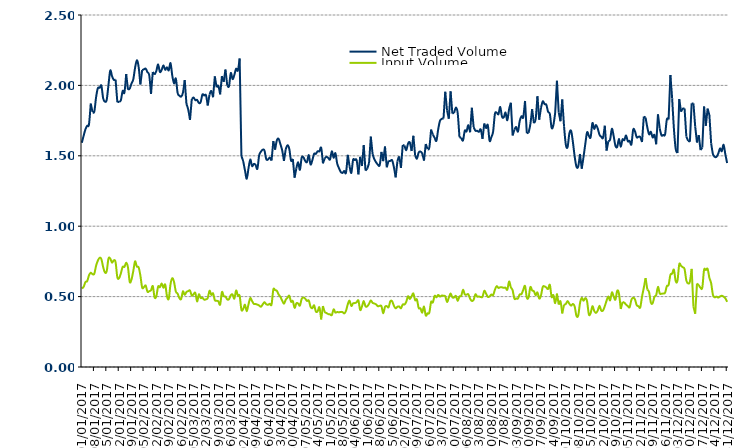
| Category | Net Traded Volume | Input Volume |
|---|---|---|
| 01/01/2017 | 1.593 | 0.557 |
| 02/01/2017 | 1.643 | 0.57 |
| 03/01/2017 | 1.688 | 0.604 |
| 04/01/2017 | 1.713 | 0.61 |
| 05/01/2017 | 1.723 | 0.651 |
| 06/01/2017 | 1.871 | 0.67 |
| 07/01/2017 | 1.812 | 0.66 |
| 08/01/2017 | 1.814 | 0.662 |
| 09/01/2017 | 1.915 | 0.719 |
| 10/01/2017 | 1.981 | 0.755 |
| 11/01/2017 | 1.983 | 0.776 |
| 12/01/2017 | 1.998 | 0.766 |
| 13/01/2017 | 1.908 | 0.709 |
| 14/01/2017 | 1.884 | 0.671 |
| 15/01/2017 | 1.898 | 0.68 |
| 16/01/2017 | 2.003 | 0.77 |
| 17/01/2017 | 2.106 | 0.77 |
| 18/01/2017 | 2.066 | 0.741 |
| 19/01/2017 | 2.039 | 0.758 |
| 20/01/2017 | 2.041 | 0.745 |
| 21/01/2017 | 1.881 | 0.637 |
| 22/01/2017 | 1.883 | 0.631 |
| 23/01/2017 | 1.895 | 0.665 |
| 24/01/2017 | 1.961 | 0.711 |
| 25/01/2017 | 1.949 | 0.711 |
| 26/01/2017 | 2.081 | 0.741 |
| 27/01/2017 | 1.97 | 0.707 |
| 28/01/2017 | 1.977 | 0.604 |
| 29/01/2017 | 2.014 | 0.622 |
| 30/01/2017 | 2.043 | 0.682 |
| 31/01/2017 | 2.124 | 0.75 |
| 01/02/2017 | 2.178 | 0.714 |
| 02/02/2017 | 2.132 | 0.708 |
| 03/02/2017 | 2.007 | 0.65 |
| 04/02/2017 | 2.109 | 0.564 |
| 05/02/2017 | 2.114 | 0.567 |
| 06/02/2017 | 2.119 | 0.579 |
| 07/02/2017 | 2.094 | 0.535 |
| 08/02/2017 | 2.072 | 0.539 |
| 09/02/2017 | 1.939 | 0.546 |
| 10/02/2017 | 2.096 | 0.574 |
| 11/02/2017 | 2.077 | 0.495 |
| 12/02/2017 | 2.102 | 0.502 |
| 13/02/2017 | 2.149 | 0.571 |
| 14/02/2017 | 2.096 | 0.567 |
| 15/02/2017 | 2.11 | 0.594 |
| 16/02/2017 | 2.143 | 0.563 |
| 17/02/2017 | 2.111 | 0.586 |
| 18/02/2017 | 2.128 | 0.503 |
| 19/02/2017 | 2.107 | 0.485 |
| 20/02/2017 | 2.158 | 0.588 |
| 21/02/2017 | 2.069 | 0.631 |
| 22/02/2017 | 2.014 | 0.603 |
| 23/02/2017 | 2.049 | 0.536 |
| 24/02/2017 | 1.947 | 0.521 |
| 25/02/2017 | 1.927 | 0.49 |
| 26/02/2017 | 1.921 | 0.483 |
| 27/02/2017 | 1.948 | 0.537 |
| 28/02/2017 | 2.038 | 0.512 |
| 01/03/2017 | 1.867 | 0.533 |
| 02/03/2017 | 1.828 | 0.539 |
| 03/03/2017 | 1.755 | 0.543 |
| 04/03/2017 | 1.903 | 0.507 |
| 05/03/2017 | 1.914 | 0.517 |
| 06/03/2017 | 1.895 | 0.526 |
| 07/03/2017 | 1.897 | 0.466 |
| 08/03/2017 | 1.875 | 0.516 |
| 09/03/2017 | 1.881 | 0.49 |
| 10/03/2017 | 1.935 | 0.492 |
| 11/03/2017 | 1.928 | 0.478 |
| 12/03/2017 | 1.93 | 0.481 |
| 13/03/2017 | 1.857 | 0.49 |
| 14/03/2017 | 1.935 | 0.542 |
| 15/03/2017 | 1.96 | 0.512 |
| 16/03/2017 | 1.916 | 0.523 |
| 17/03/2017 | 2.064 | 0.475 |
| 18/03/2017 | 1.987 | 0.47 |
| 19/03/2017 | 1.997 | 0.466 |
| 20/03/2017 | 1.936 | 0.443 |
| 21/03/2017 | 2.066 | 0.532 |
| 22/03/2017 | 2.025 | 0.504 |
| 23/03/2017 | 2.113 | 0.5 |
| 24/03/2017 | 2 | 0.48 |
| 25/03/2017 | 1.994 | 0.482 |
| 26/03/2017 | 2.088 | 0.51 |
| 27/03/2017 | 2.045 | 0.514 |
| 28/03/2017 | 2.074 | 0.486 |
| 29/03/2017 | 2.118 | 0.543 |
| 30/03/2017 | 2.106 | 0.507 |
| 31/03/2017 | 2.191 | 0.506 |
| 01/04/2017 | 1.499 | 0.407 |
| 02/04/2017 | 1.463 | 0.412 |
| 03/04/2017 | 1.397 | 0.442 |
| 04/04/2017 | 1.337 | 0.396 |
| 05/04/2017 | 1.412 | 0.446 |
| 06/04/2017 | 1.474 | 0.489 |
| 07/04/2017 | 1.427 | 0.468 |
| 08/04/2017 | 1.442 | 0.448 |
| 09/04/2017 | 1.436 | 0.447 |
| 10/04/2017 | 1.408 | 0.443 |
| 11/04/2017 | 1.503 | 0.437 |
| 12/04/2017 | 1.529 | 0.428 |
| 13/04/2017 | 1.543 | 0.444 |
| 14/04/2017 | 1.537 | 0.46 |
| 15/04/2017 | 1.476 | 0.446 |
| 16/04/2017 | 1.474 | 0.442 |
| 17/04/2017 | 1.488 | 0.449 |
| 18/04/2017 | 1.466 | 0.444 |
| 19/04/2017 | 1.605 | 0.55 |
| 20/04/2017 | 1.543 | 0.546 |
| 21/04/2017 | 1.61 | 0.541 |
| 22/04/2017 | 1.62 | 0.515 |
| 23/04/2017 | 1.582 | 0.497 |
| 24/04/2017 | 1.538 | 0.471 |
| 25/04/2017 | 1.464 | 0.449 |
| 26/04/2017 | 1.547 | 0.478 |
| 27/04/2017 | 1.576 | 0.492 |
| 28/04/2017 | 1.549 | 0.506 |
| 29/04/2017 | 1.466 | 0.464 |
| 30/04/2017 | 1.477 | 0.468 |
| 01/05/2017 | 1.344 | 0.42 |
| 02/05/2017 | 1.412 | 0.452 |
| 03/05/2017 | 1.454 | 0.451 |
| 04/05/2017 | 1.401 | 0.436 |
| 05/05/2017 | 1.487 | 0.484 |
| 06/05/2017 | 1.489 | 0.493 |
| 07/05/2017 | 1.463 | 0.485 |
| 08/05/2017 | 1.456 | 0.469 |
| 09/05/2017 | 1.505 | 0.472 |
| 10/05/2017 | 1.439 | 0.428 |
| 11/05/2017 | 1.469 | 0.417 |
| 12/05/2017 | 1.514 | 0.438 |
| 13/05/2017 | 1.514 | 0.394 |
| 14/05/2017 | 1.532 | 0.395 |
| 15/05/2017 | 1.531 | 0.423 |
| 16/05/2017 | 1.556 | 0.338 |
| 17/05/2017 | 1.447 | 0.433 |
| 18/05/2017 | 1.482 | 0.392 |
| 19/05/2017 | 1.493 | 0.383 |
| 20/05/2017 | 1.485 | 0.376 |
| 21/05/2017 | 1.474 | 0.374 |
| 22/05/2017 | 1.532 | 0.369 |
| 23/05/2017 | 1.486 | 0.409 |
| 24/05/2017 | 1.519 | 0.387 |
| 25/05/2017 | 1.446 | 0.39 |
| 26/05/2017 | 1.413 | 0.388 |
| 27/05/2017 | 1.386 | 0.391 |
| 28/05/2017 | 1.378 | 0.39 |
| 29/05/2017 | 1.392 | 0.38 |
| 30/05/2017 | 1.381 | 0.399 |
| 31/05/2017 | 1.507 | 0.445 |
| 01/06/2017 | 1.427 | 0.471 |
| 02/06/2017 | 1.379 | 0.433 |
| 03/06/2017 | 1.472 | 0.452 |
| 04/06/2017 | 1.469 | 0.454 |
| 05/06/2017 | 1.469 | 0.46 |
| 06/06/2017 | 1.368 | 0.472 |
| 07/06/2017 | 1.493 | 0.405 |
| 08/06/2017 | 1.428 | 0.43 |
| 09/06/2017 | 1.576 | 0.469 |
| 10/06/2017 | 1.396 | 0.431 |
| 11/06/2017 | 1.408 | 0.431 |
| 12/06/2017 | 1.448 | 0.449 |
| 13/06/2017 | 1.636 | 0.473 |
| 14/06/2017 | 1.512 | 0.456 |
| 15/06/2017 | 1.475 | 0.451 |
| 16/06/2017 | 1.454 | 0.444 |
| 17/06/2017 | 1.436 | 0.432 |
| 18/06/2017 | 1.434 | 0.434 |
| 19/06/2017 | 1.528 | 0.432 |
| 20/06/2017 | 1.462 | 0.381 |
| 21/06/2017 | 1.566 | 0.427 |
| 22/06/2017 | 1.418 | 0.432 |
| 23/06/2017 | 1.464 | 0.424 |
| 24/06/2017 | 1.464 | 0.467 |
| 25/06/2017 | 1.469 | 0.467 |
| 26/06/2017 | 1.421 | 0.436 |
| 27/06/2017 | 1.347 | 0.417 |
| 28/06/2017 | 1.46 | 0.428 |
| 29/06/2017 | 1.491 | 0.43 |
| 30/06/2017 | 1.414 | 0.417 |
| 01/07/2017 | 1.576 | 0.444 |
| 02/07/2017 | 1.572 | 0.444 |
| 03/07/2017 | 1.54 | 0.464 |
| 04/07/2017 | 1.587 | 0.502 |
| 05/07/2017 | 1.594 | 0.483 |
| 06/07/2017 | 1.534 | 0.502 |
| 07/07/2017 | 1.642 | 0.522 |
| 08/07/2017 | 1.504 | 0.474 |
| 09/07/2017 | 1.48 | 0.48 |
| 10/07/2017 | 1.523 | 0.419 |
| 11/07/2017 | 1.53 | 0.416 |
| 12/07/2017 | 1.516 | 0.386 |
| 13/07/2017 | 1.466 | 0.429 |
| 14/07/2017 | 1.584 | 0.366 |
| 15/07/2017 | 1.548 | 0.381 |
| 16/07/2017 | 1.559 | 0.385 |
| 17/07/2017 | 1.686 | 0.462 |
| 18/07/2017 | 1.651 | 0.458 |
| 19/07/2017 | 1.628 | 0.505 |
| 20/07/2017 | 1.607 | 0.495 |
| 21/07/2017 | 1.688 | 0.512 |
| 22/07/2017 | 1.748 | 0.5 |
| 23/07/2017 | 1.762 | 0.507 |
| 24/07/2017 | 1.766 | 0.506 |
| 25/07/2017 | 1.955 | 0.502 |
| 26/07/2017 | 1.823 | 0.462 |
| 27/07/2017 | 1.763 | 0.492 |
| 28/07/2017 | 1.958 | 0.523 |
| 29/07/2017 | 1.801 | 0.495 |
| 30/07/2017 | 1.805 | 0.494 |
| 31/07/2017 | 1.843 | 0.504 |
| 01/08/2017 | 1.804 | 0.47 |
| 02/08/2017 | 1.633 | 0.5 |
| 03/08/2017 | 1.627 | 0.505 |
| 04/08/2017 | 1.609 | 0.548 |
| 05/08/2017 | 1.678 | 0.516 |
| 06/08/2017 | 1.673 | 0.514 |
| 07/08/2017 | 1.718 | 0.516 |
| 08/08/2017 | 1.667 | 0.485 |
| 09/08/2017 | 1.841 | 0.469 |
| 10/08/2017 | 1.704 | 0.478 |
| 11/08/2017 | 1.678 | 0.516 |
| 12/08/2017 | 1.678 | 0.5 |
| 13/08/2017 | 1.67 | 0.5 |
| 14/08/2017 | 1.687 | 0.497 |
| 15/08/2017 | 1.62 | 0.498 |
| 16/08/2017 | 1.729 | 0.541 |
| 17/08/2017 | 1.697 | 0.522 |
| 18/08/2017 | 1.718 | 0.498 |
| 19/08/2017 | 1.607 | 0.501 |
| 20/08/2017 | 1.633 | 0.514 |
| 21/08/2017 | 1.673 | 0.51 |
| 22/08/2017 | 1.797 | 0.549 |
| 23/08/2017 | 1.806 | 0.574 |
| 24/08/2017 | 1.795 | 0.562 |
| 25/08/2017 | 1.846 | 0.566 |
| 26/08/2017 | 1.778 | 0.566 |
| 27/08/2017 | 1.773 | 0.562 |
| 28/08/2017 | 1.808 | 0.564 |
| 29/08/2017 | 1.753 | 0.549 |
| 30/08/2017 | 1.831 | 0.607 |
| 31/08/2017 | 1.877 | 0.566 |
| 01/09/2017 | 1.645 | 0.545 |
| 02/09/2017 | 1.685 | 0.486 |
| 03/09/2017 | 1.704 | 0.487 |
| 04/09/2017 | 1.672 | 0.487 |
| 05/09/2017 | 1.747 | 0.515 |
| 06/09/2017 | 1.781 | 0.517 |
| 07/09/2017 | 1.775 | 0.549 |
| 08/09/2017 | 1.89 | 0.575 |
| 09/09/2017 | 1.661 | 0.493 |
| 10/09/2017 | 1.663 | 0.494 |
| 11/09/2017 | 1.725 | 0.568 |
| 12/09/2017 | 1.831 | 0.544 |
| 13/09/2017 | 1.732 | 0.538 |
| 14/09/2017 | 1.762 | 0.509 |
| 15/09/2017 | 1.923 | 0.53 |
| 16/09/2017 | 1.756 | 0.486 |
| 17/09/2017 | 1.841 | 0.509 |
| 18/09/2017 | 1.887 | 0.569 |
| 19/09/2017 | 1.868 | 0.572 |
| 20/09/2017 | 1.863 | 0.565 |
| 21/09/2017 | 1.813 | 0.554 |
| 22/09/2017 | 1.796 | 0.584 |
| 23/09/2017 | 1.698 | 0.497 |
| 24/09/2017 | 1.719 | 0.51 |
| 25/09/2017 | 1.804 | 0.454 |
| 26/09/2017 | 2.033 | 0.521 |
| 27/09/2017 | 1.809 | 0.443 |
| 28/09/2017 | 1.746 | 0.466 |
| 29/09/2017 | 1.9 | 0.38 |
| 30/09/2017 | 1.709 | 0.443 |
| 01/10/2017 | 1.58 | 0.447 |
| 02/10/2017 | 1.562 | 0.468 |
| 03/10/2017 | 1.658 | 0.449 |
| 04/10/2017 | 1.677 | 0.436 |
| 05/10/2017 | 1.598 | 0.448 |
| 06/10/2017 | 1.495 | 0.43 |
| 07/10/2017 | 1.423 | 0.363 |
| 08/10/2017 | 1.424 | 0.365 |
| 09/10/2017 | 1.513 | 0.453 |
| 10/10/2017 | 1.408 | 0.49 |
| 11/10/2017 | 1.491 | 0.471 |
| 12/10/2017 | 1.584 | 0.49 |
| 13/10/2017 | 1.667 | 0.466 |
| 14/10/2017 | 1.643 | 0.374 |
| 15/10/2017 | 1.631 | 0.382 |
| 16/10/2017 | 1.732 | 0.432 |
| 17/10/2017 | 1.691 | 0.399 |
| 18/10/2017 | 1.719 | 0.384 |
| 19/10/2017 | 1.694 | 0.401 |
| 20/10/2017 | 1.65 | 0.435 |
| 21/10/2017 | 1.635 | 0.4 |
| 22/10/2017 | 1.629 | 0.402 |
| 23/10/2017 | 1.714 | 0.432 |
| 24/10/2017 | 1.537 | 0.471 |
| 25/10/2017 | 1.603 | 0.502 |
| 26/10/2017 | 1.616 | 0.473 |
| 27/10/2017 | 1.692 | 0.53 |
| 28/10/2017 | 1.64 | 0.501 |
| 29/10/2017 | 1.571 | 0.478 |
| 30/10/2017 | 1.564 | 0.542 |
| 31/10/2017 | 1.62 | 0.52 |
| 01/11/2017 | 1.564 | 0.412 |
| 02/11/2017 | 1.617 | 0.462 |
| 03/11/2017 | 1.611 | 0.457 |
| 04/11/2017 | 1.645 | 0.443 |
| 05/11/2017 | 1.603 | 0.433 |
| 06/11/2017 | 1.606 | 0.424 |
| 07/11/2017 | 1.581 | 0.477 |
| 08/11/2017 | 1.685 | 0.492 |
| 09/11/2017 | 1.675 | 0.481 |
| 10/11/2017 | 1.631 | 0.439 |
| 11/11/2017 | 1.635 | 0.431 |
| 12/11/2017 | 1.633 | 0.423 |
| 13/11/2017 | 1.598 | 0.501 |
| 14/11/2017 | 1.778 | 0.562 |
| 15/11/2017 | 1.772 | 0.632 |
| 16/11/2017 | 1.701 | 0.55 |
| 17/11/2017 | 1.652 | 0.531 |
| 18/11/2017 | 1.67 | 0.457 |
| 19/11/2017 | 1.63 | 0.453 |
| 20/11/2017 | 1.649 | 0.499 |
| 21/11/2017 | 1.582 | 0.511 |
| 22/11/2017 | 1.795 | 0.569 |
| 23/11/2017 | 1.692 | 0.522 |
| 24/11/2017 | 1.645 | 0.521 |
| 25/11/2017 | 1.648 | 0.522 |
| 26/11/2017 | 1.652 | 0.528 |
| 27/11/2017 | 1.758 | 0.574 |
| 28/11/2017 | 1.759 | 0.583 |
| 29/11/2017 | 2.074 | 0.655 |
| 30/11/2017 | 1.907 | 0.663 |
| 01/12/2017 | 1.69 | 0.691 |
| 02/12/2017 | 1.548 | 0.609 |
| 03/12/2017 | 1.519 | 0.613 |
| 04/12/2017 | 1.903 | 0.73 |
| 05/12/2017 | 1.814 | 0.718 |
| 06/12/2017 | 1.834 | 0.709 |
| 07/12/2017 | 1.837 | 0.695 |
| 08/12/2017 | 1.637 | 0.614 |
| 09/12/2017 | 1.607 | 0.593 |
| 10/12/2017 | 1.6 | 0.606 |
| 11/12/2017 | 1.872 | 0.697 |
| 12/12/2017 | 1.872 | 0.428 |
| 13/12/2017 | 1.707 | 0.378 |
| 14/12/2017 | 1.595 | 0.593 |
| 15/12/2017 | 1.647 | 0.582 |
| 16/12/2017 | 1.541 | 0.562 |
| 17/12/2017 | 1.559 | 0.564 |
| 18/12/2017 | 1.85 | 0.691 |
| 19/12/2017 | 1.713 | 0.689 |
| 20/12/2017 | 1.835 | 0.697 |
| 21/12/2017 | 1.789 | 0.633 |
| 22/12/2017 | 1.588 | 0.594 |
| 23/12/2017 | 1.513 | 0.512 |
| 24/12/2017 | 1.493 | 0.495 |
| 25/12/2017 | 1.493 | 0.5 |
| 26/12/2017 | 1.516 | 0.493 |
| 27/12/2017 | 1.552 | 0.501 |
| 28/12/2017 | 1.532 | 0.506 |
| 29/12/2017 | 1.578 | 0.5 |
| 30/12/2017 | 1.511 | 0.488 |
| 31/12/2017 | 1.449 | 0.463 |